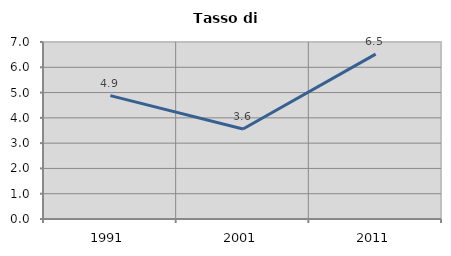
| Category | Tasso di disoccupazione   |
|---|---|
| 1991.0 | 4.878 |
| 2001.0 | 3.558 |
| 2011.0 | 6.519 |